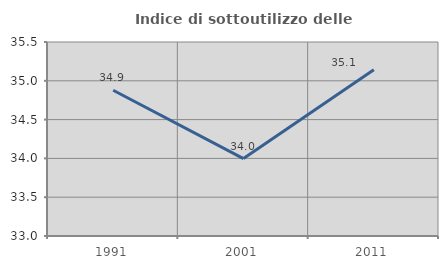
| Category | Indice di sottoutilizzo delle abitazioni  |
|---|---|
| 1991.0 | 34.878 |
| 2001.0 | 33.998 |
| 2011.0 | 35.142 |